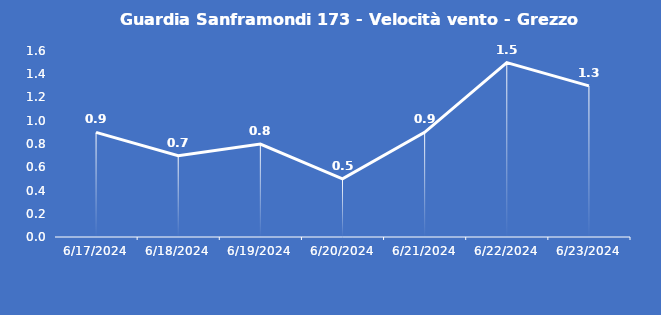
| Category | Guardia Sanframondi 173 - Velocità vento - Grezzo (m/s) |
|---|---|
| 6/17/24 | 0.9 |
| 6/18/24 | 0.7 |
| 6/19/24 | 0.8 |
| 6/20/24 | 0.5 |
| 6/21/24 | 0.9 |
| 6/22/24 | 1.5 |
| 6/23/24 | 1.3 |